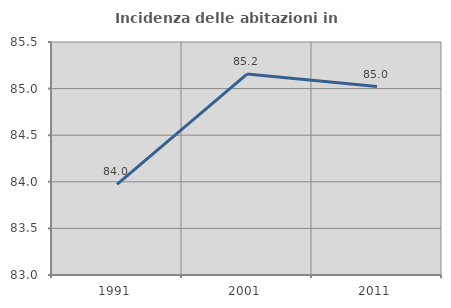
| Category | Incidenza delle abitazioni in proprietà  |
|---|---|
| 1991.0 | 83.972 |
| 2001.0 | 85.156 |
| 2011.0 | 85.022 |